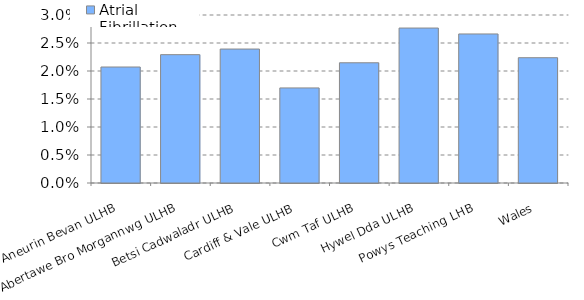
| Category | Atrial Fibrillation |
|---|---|
| Aneurin Bevan ULHB | 0.021 |
| Abertawe Bro Morgannwg ULHB | 0.023 |
| Betsi Cadwaladr ULHB | 0.024 |
| Cardiff & Vale ULHB | 0.017 |
| Cwm Taf ULHB | 0.021 |
| Hywel Dda ULHB | 0.028 |
| Powys Teaching LHB | 0.027 |
| Wales | 0.022 |